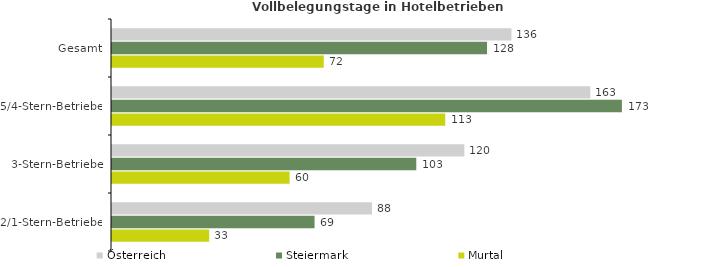
| Category | Österreich | Steiermark | Murtal |
|---|---|---|---|
| Gesamt | 135.866 | 127.561 | 72.023 |
| 5/4-Stern-Betriebe | 162.683 | 173.435 | 113.348 |
| 3-Stern-Betriebe | 119.851 | 103.499 | 60.41 |
| 2/1-Stern-Betriebe | 88.435 | 68.894 | 33.053 |